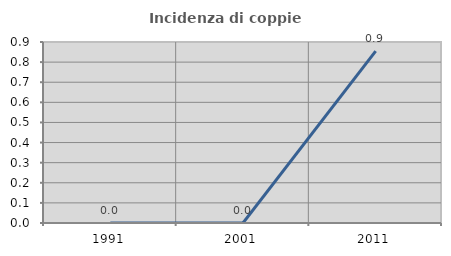
| Category | Incidenza di coppie miste |
|---|---|
| 1991.0 | 0 |
| 2001.0 | 0 |
| 2011.0 | 0.855 |